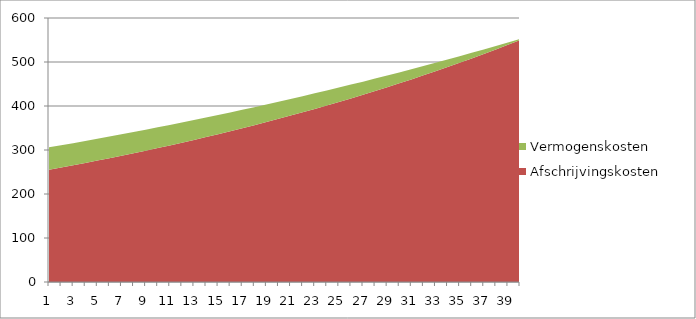
| Category | Afschrijvingskosten | Vermogenskosten |
|---|---|---|
| 0 | 254.975 | 51 |
| 1 | 260.049 | 50.715 |
| 2 | 265.224 | 50.397 |
| 3 | 270.502 | 50.048 |
| 4 | 275.885 | 49.664 |
| 5 | 281.375 | 49.245 |
| 6 | 286.974 | 48.79 |
| 7 | 292.685 | 48.298 |
| 8 | 298.51 | 47.766 |
| 9 | 304.45 | 47.194 |
| 10 | 310.509 | 46.581 |
| 11 | 316.688 | 45.924 |
| 12 | 322.99 | 45.223 |
| 13 | 329.417 | 44.476 |
| 14 | 335.973 | 43.681 |
| 15 | 342.658 | 42.837 |
| 16 | 349.477 | 41.941 |
| 17 | 356.432 | 40.994 |
| 18 | 363.525 | 39.992 |
| 19 | 370.759 | 38.934 |
| 20 | 378.137 | 37.817 |
| 21 | 385.662 | 36.641 |
| 22 | 393.337 | 35.404 |
| 23 | 401.164 | 34.102 |
| 24 | 409.147 | 32.735 |
| 25 | 417.289 | 31.3 |
| 26 | 425.594 | 29.794 |
| 27 | 434.063 | 28.217 |
| 28 | 442.701 | 26.565 |
| 29 | 451.51 | 24.836 |
| 30 | 460.495 | 23.027 |
| 31 | 469.659 | 21.137 |
| 32 | 479.006 | 19.162 |
| 33 | 488.538 | 17.1 |
| 34 | 498.26 | 14.949 |
| 35 | 508.175 | 12.706 |
| 36 | 518.288 | 10.367 |
| 37 | 528.602 | 7.93 |
| 38 | 539.121 | 5.392 |
| 39 | 549.849 | 2.75 |